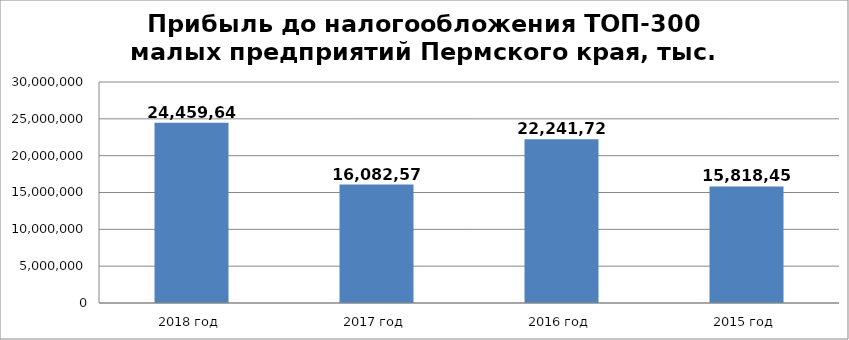
| Category | Series 0 |
|---|---|
| 2018 год | 24459642 |
| 2017 год | 16082574 |
| 2016 год | 22241726 |
| 2015 год | 15818452 |